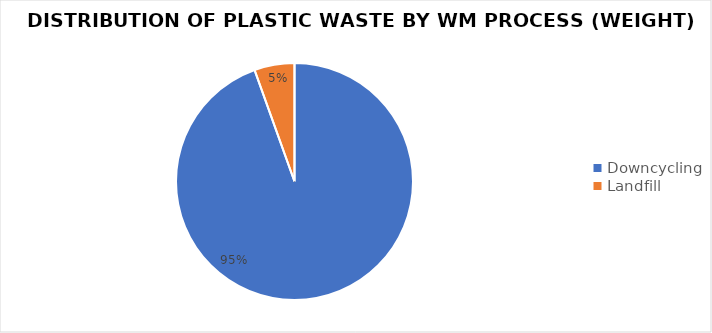
| Category | Series 0 |
|---|---|
| Downcycling | 467.613 |
| Landfill | 27.104 |